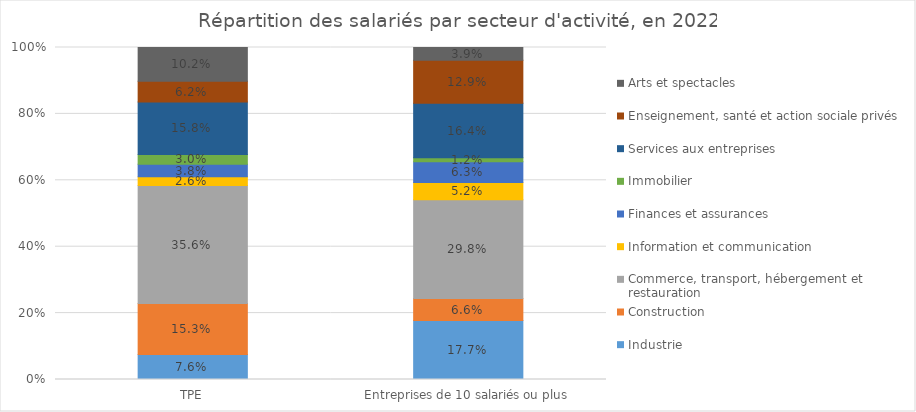
| Category | Industrie | Construction | Commerce, transport, hébergement et restauration | Information et communication | Finances et assurances | Immobilier | Services aux entreprises | Enseignement, santé et action sociale privés | Arts et spectacles |
|---|---|---|---|---|---|---|---|---|---|
| TPE | 0.076 | 0.153 | 0.356 | 0.026 | 0.038 | 0.03 | 0.158 | 0.062 | 0.102 |
| Entreprises de 10 salariés ou plus | 0.177 | 0.066 | 0.298 | 0.052 | 0.063 | 0.012 | 0.164 | 0.129 | 0.039 |